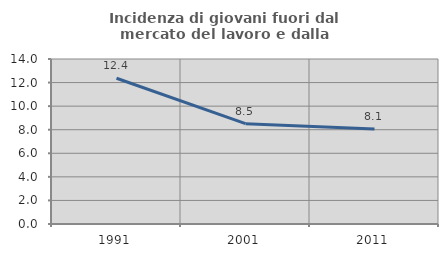
| Category | Incidenza di giovani fuori dal mercato del lavoro e dalla formazione  |
|---|---|
| 1991.0 | 12.367 |
| 2001.0 | 8.515 |
| 2011.0 | 8.052 |